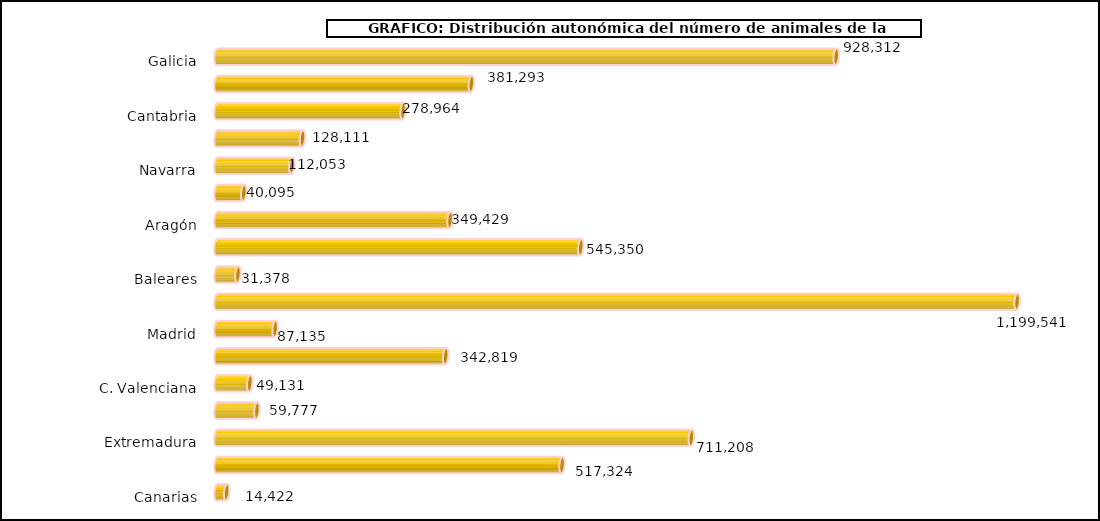
| Category | num. Animales |
|---|---|
|   Galicia | 928312 |
|   P. de Asturias | 381293 |
|   Cantabria | 278964 |
|   País Vasco | 128111 |
|   Navarra | 112053 |
|   La Rioja | 40095 |
|   Aragón | 349429 |
|   Cataluña | 545350 |
|   Baleares | 31378 |
|   Castilla y León | 1199541 |
|   Madrid | 87135 |
|   Castilla – La Mancha | 342819 |
|   C. Valenciana | 49131 |
|   R. de Murcia | 59777 |
|   Extremadura | 711208 |
|   Andalucía | 517324 |
|   Canarias | 14422 |